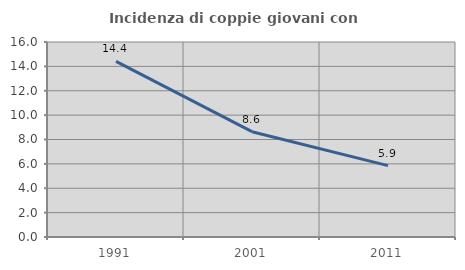
| Category | Incidenza di coppie giovani con figli |
|---|---|
| 1991.0 | 14.416 |
| 2001.0 | 8.64 |
| 2011.0 | 5.859 |